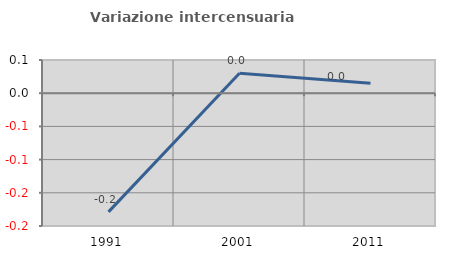
| Category | Variazione intercensuaria annua |
|---|---|
| 1991.0 | -0.179 |
| 2001.0 | 0.03 |
| 2011.0 | 0.015 |